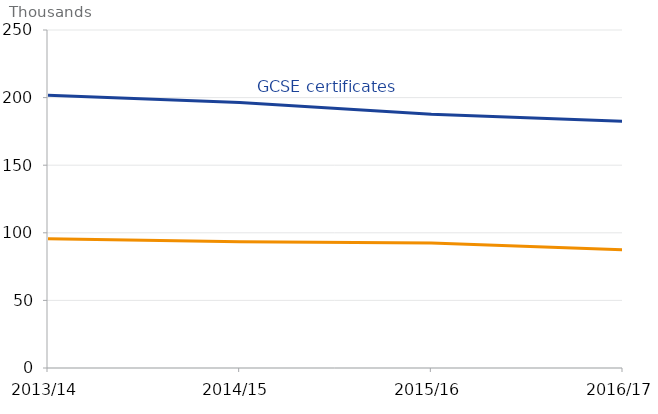
| Category | Number of GCSE certifications | Number of A level certifications |
|---|---|---|
| 2013/14 | 201665 | 95635 |
| 2014/15 | 196465 | 93460 |
| 2015/16 | 187680 | 92510 |
| 2016/17 | 182570 | 87365 |